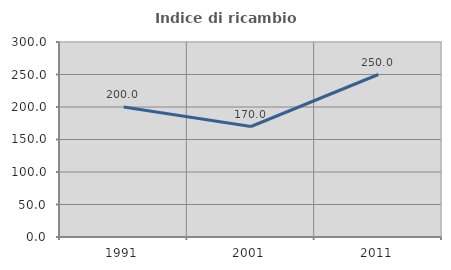
| Category | Indice di ricambio occupazionale  |
|---|---|
| 1991.0 | 200 |
| 2001.0 | 170 |
| 2011.0 | 250 |